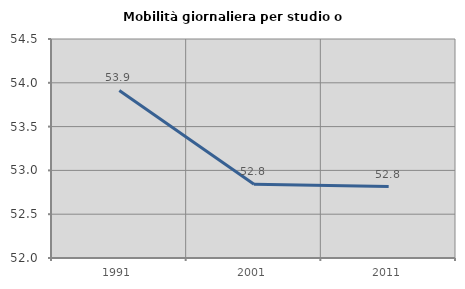
| Category | Mobilità giornaliera per studio o lavoro |
|---|---|
| 1991.0 | 53.913 |
| 2001.0 | 52.841 |
| 2011.0 | 52.815 |